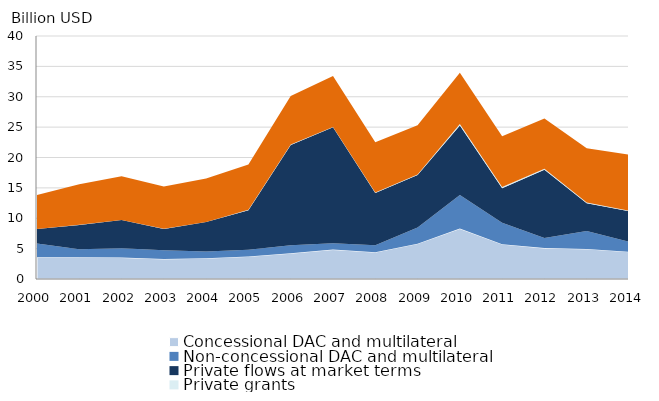
| Category | Concessional DAC and multilateral | Non-concessional DAC and multilateral | Private flows at market terms | Private grants | Remittances |
|---|---|---|---|---|---|
| 2000.0 | 3.571 | 2.293 | 2.357 | 0.022 | 5.592 |
| 2001.0 | 3.6 | 1.289 | 4.011 | 0.024 | 6.662 |
| 2002.0 | 3.533 | 1.531 | 4.642 | 0.016 | 7.193 |
| 2003.0 | 3.295 | 1.432 | 3.521 | 0.02 | 6.971 |
| 2004.0 | 3.419 | 1.127 | 4.818 | 0.031 | 7.147 |
| 2005.0 | 3.719 | 1.1 | 6.518 | 0.068 | 7.461 |
| 2006.0 | 4.237 | 1.33 | 16.505 | 0.069 | 8.001 |
| 2007.0 | 4.845 | 1.051 | 19.073 | 0.063 | 8.384 |
| 2008.0 | 4.411 | 1.156 | 8.591 | 0.065 | 8.307 |
| 2009.0 | 5.822 | 2.642 | 8.669 | 0.068 | 8.126 |
| 2010.0 | 8.294 | 5.552 | 11.423 | 0.256 | 8.416 |
| 2011.0 | 5.738 | 3.54 | 5.655 | 0.192 | 8.381 |
| 2012.0 | 5.082 | 1.686 | 11.234 | 0.128 | 8.273 |
| 2013.0 | 4.951 | 2.934 | 4.592 | 0.119 | 8.933 |
| 2014.0 | 4.488 | 1.633 | 5.027 | 0.091 | 9.228 |